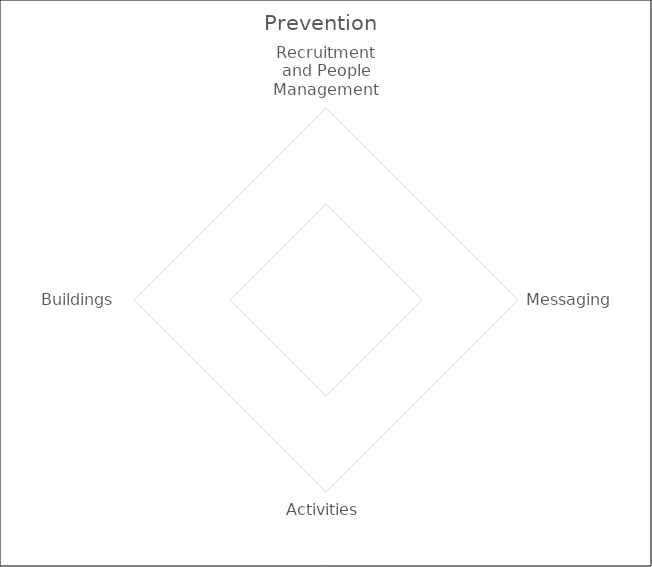
| Category | Series 0 |
|---|---|
| Recruitment and People Management | 0 |
| Messaging | 0 |
| Activities | 0 |
| Buildings  | 0 |